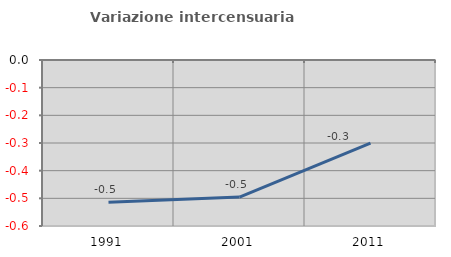
| Category | Variazione intercensuaria annua |
|---|---|
| 1991.0 | -0.514 |
| 2001.0 | -0.495 |
| 2011.0 | -0.3 |